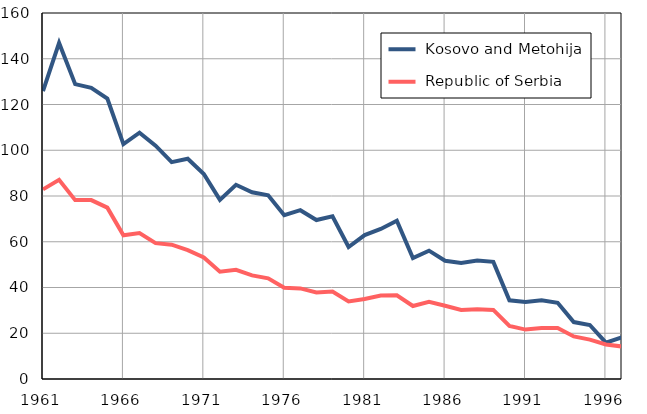
| Category |  Kosovo and Metohija |  Republic of Serbia |
|---|---|---|
| 1961.0 | 125.9 | 82.9 |
| 1962.0 | 146.9 | 87.1 |
| 1963.0 | 128.9 | 78.2 |
| 1964.0 | 127.3 | 78.2 |
| 1965.0 | 122.6 | 74.9 |
| 1966.0 | 102.7 | 62.8 |
| 1967.0 | 107.7 | 63.8 |
| 1968.0 | 102 | 59.4 |
| 1969.0 | 94.8 | 58.7 |
| 1970.0 | 96.3 | 56.3 |
| 1971.0 | 89.6 | 53.1 |
| 1972.0 | 78.3 | 46.9 |
| 1973.0 | 84.9 | 47.7 |
| 1974.0 | 81.6 | 45.3 |
| 1975.0 | 80.3 | 44 |
| 1976.0 | 71.6 | 39.9 |
| 1977.0 | 73.8 | 39.6 |
| 1978.0 | 69.5 | 37.8 |
| 1979.0 | 71.1 | 38.2 |
| 1980.0 | 57.7 | 33.9 |
| 1981.0 | 62.9 | 35 |
| 1982.0 | 65.6 | 36.5 |
| 1983.0 | 69.2 | 36.6 |
| 1984.0 | 52.9 | 31.9 |
| 1985.0 | 56.1 | 33.7 |
| 1986.0 | 51.7 | 32 |
| 1987.0 | 50.7 | 30.2 |
| 1988.0 | 51.8 | 30.5 |
| 1989.0 | 51.2 | 30.2 |
| 1990.0 | 34.4 | 23.2 |
| 1991.0 | 33.7 | 21.6 |
| 1992.0 | 34.4 | 22.3 |
| 1993.0 | 33.3 | 22.3 |
| 1994.0 | 24.9 | 18.6 |
| 1995.0 | 23.6 | 17.2 |
| 1996.0 | 15.9 | 15.1 |
| 1997.0 | 18.2 | 14.2 |